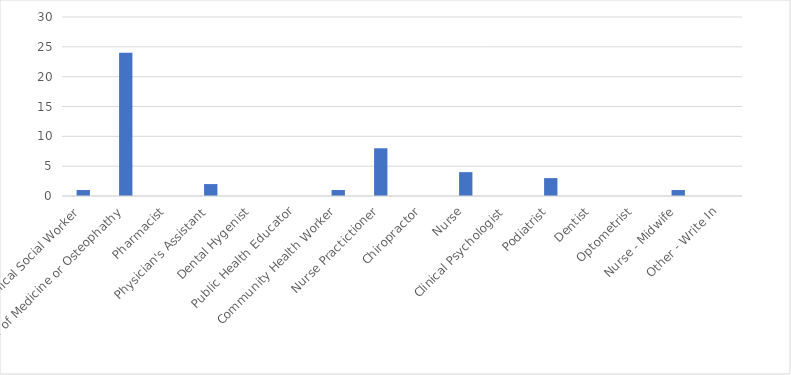
| Category | Number of Responses |
|---|---|
| Clinical Social Worker | 1 |
| Doctor of Medicine or Osteophathy | 24 |
| Pharmacist | 0 |
| Physician's Assistant | 2 |
| Dental Hygenist | 0 |
| Public Health Educator | 0 |
| Community Health Worker | 1 |
| Nurse Practictioner | 8 |
| Chiropractor | 0 |
| Nurse | 4 |
| Clinical Psychologist | 0 |
| Podiatrist | 3 |
| Dentist | 0 |
| Optometrist | 0 |
| Nurse - Midwife | 1 |
| Other - Write In | 0 |